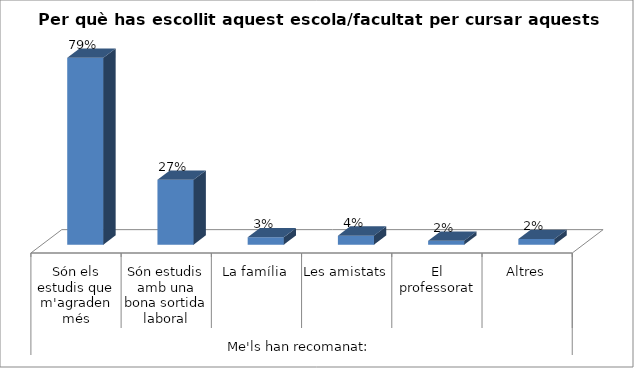
| Category | Series 0 |
|---|---|
| 0 | 0.788 |
| 1 | 0.274 |
| 2 | 0.031 |
| 3 | 0.038 |
| 4 | 0.017 |
| 5 | 0.024 |